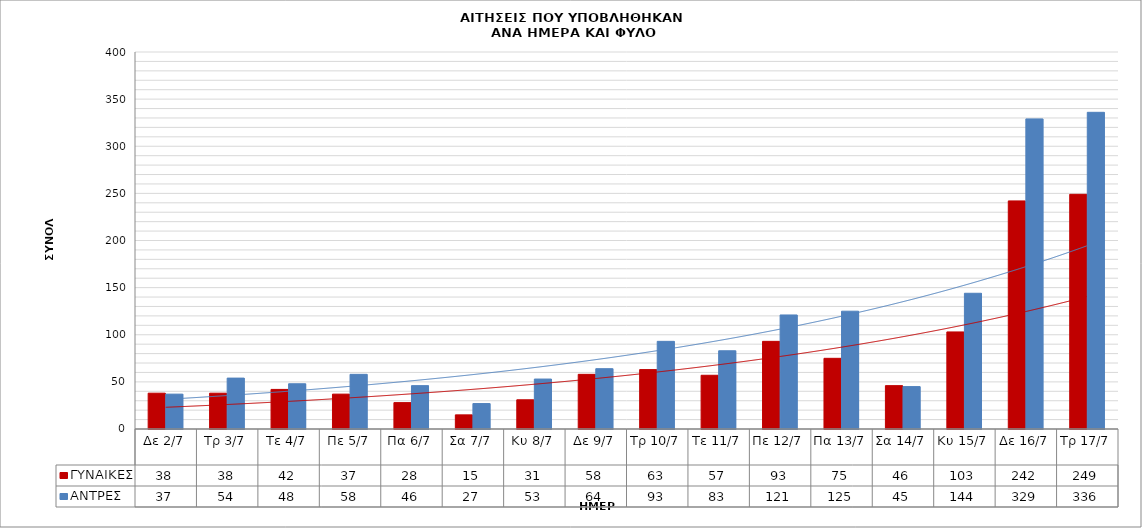
| Category | ΓΥΝΑΙΚΕΣ | ΑΝΤΡΕΣ |
|---|---|---|
| Δε 2/7 | 38 | 37 |
| Τρ 3/7 | 38 | 54 |
| Τε 4/7 | 42 | 48 |
| Πε 5/7 | 37 | 58 |
| Πα 6/7 | 28 | 46 |
| Σα 7/7 | 15 | 27 |
| Κυ 8/7 | 31 | 53 |
| Δε 9/7 | 58 | 64 |
| Τρ 10/7 | 63 | 93 |
| Τε 11/7 | 57 | 83 |
| Πε 12/7 | 93 | 121 |
| Πα 13/7 | 75 | 125 |
| Σα 14/7 | 46 | 45 |
| Κυ 15/7 | 103 | 144 |
| Δε 16/7 | 242 | 329 |
| Τρ 17/7 | 249 | 336 |